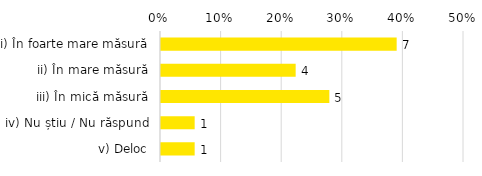
| Category | Total |
|---|---|
| i) În foarte mare măsură | 0.389 |
| ii) În mare măsură | 0.222 |
| iii) În mică măsură | 0.278 |
| iv) Nu știu / Nu răspund | 0.056 |
| v) Deloc | 0.056 |